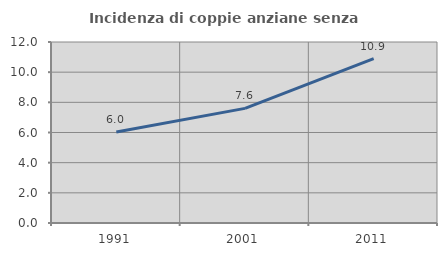
| Category | Incidenza di coppie anziane senza figli  |
|---|---|
| 1991.0 | 6.037 |
| 2001.0 | 7.599 |
| 2011.0 | 10.898 |